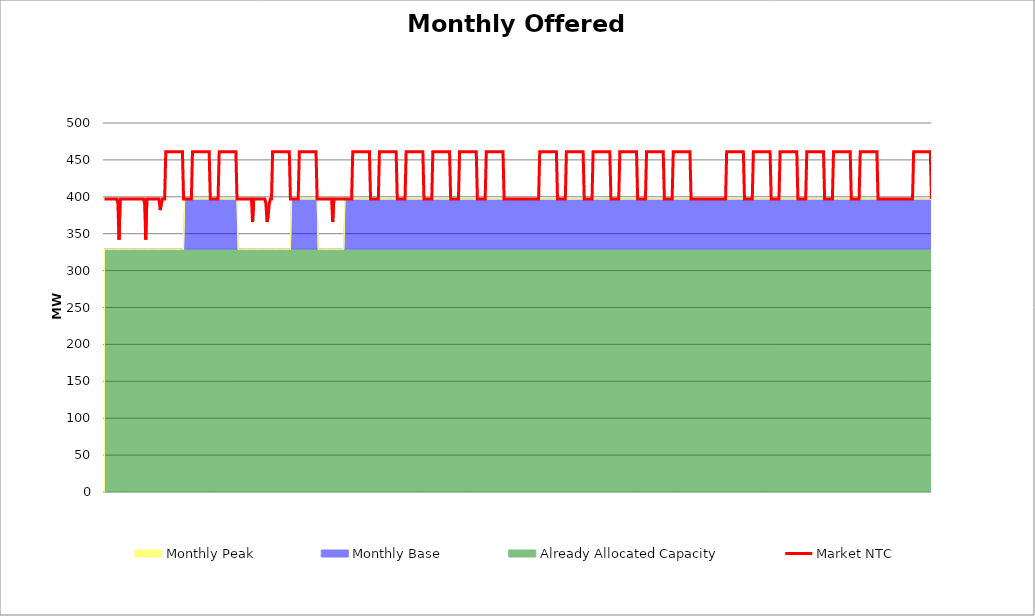
| Category | Market NTC |
|---|---|
| 0 | 397 |
| 1 | 397 |
| 2 | 397 |
| 3 | 397 |
| 4 | 397 |
| 5 | 397 |
| 6 | 397 |
| 7 | 397 |
| 8 | 397 |
| 9 | 397 |
| 10 | 397 |
| 11 | 397 |
| 12 | 391 |
| 13 | 342 |
| 14 | 397 |
| 15 | 397 |
| 16 | 397 |
| 17 | 397 |
| 18 | 397 |
| 19 | 397 |
| 20 | 397 |
| 21 | 397 |
| 22 | 397 |
| 23 | 397 |
| 24 | 397 |
| 25 | 397 |
| 26 | 397 |
| 27 | 397 |
| 28 | 397 |
| 29 | 397 |
| 30 | 397 |
| 31 | 397 |
| 32 | 397 |
| 33 | 397 |
| 34 | 397 |
| 35 | 397 |
| 36 | 391 |
| 37 | 342 |
| 38 | 397 |
| 39 | 397 |
| 40 | 397 |
| 41 | 397 |
| 42 | 397 |
| 43 | 397 |
| 44 | 397 |
| 45 | 397 |
| 46 | 397 |
| 47 | 397 |
| 48 | 397 |
| 49 | 397 |
| 50 | 382 |
| 51 | 391 |
| 52 | 397 |
| 53 | 397 |
| 54 | 397 |
| 55 | 461 |
| 56 | 461 |
| 57 | 461 |
| 58 | 461 |
| 59 | 461 |
| 60 | 461 |
| 61 | 461 |
| 62 | 461 |
| 63 | 461 |
| 64 | 461 |
| 65 | 461 |
| 66 | 461 |
| 67 | 461 |
| 68 | 461 |
| 69 | 461 |
| 70 | 461 |
| 71 | 397 |
| 72 | 397 |
| 73 | 397 |
| 74 | 397 |
| 75 | 397 |
| 76 | 397 |
| 77 | 397 |
| 78 | 397 |
| 79 | 461 |
| 80 | 461 |
| 81 | 461 |
| 82 | 461 |
| 83 | 461 |
| 84 | 461 |
| 85 | 461 |
| 86 | 461 |
| 87 | 461 |
| 88 | 461 |
| 89 | 461 |
| 90 | 461 |
| 91 | 461 |
| 92 | 461 |
| 93 | 461 |
| 94 | 461 |
| 95 | 397 |
| 96 | 397 |
| 97 | 397 |
| 98 | 397 |
| 99 | 397 |
| 100 | 397 |
| 101 | 397 |
| 102 | 397 |
| 103 | 461 |
| 104 | 461 |
| 105 | 461 |
| 106 | 461 |
| 107 | 461 |
| 108 | 461 |
| 109 | 461 |
| 110 | 461 |
| 111 | 461 |
| 112 | 461 |
| 113 | 461 |
| 114 | 461 |
| 115 | 461 |
| 116 | 461 |
| 117 | 461 |
| 118 | 461 |
| 119 | 397 |
| 120 | 397 |
| 121 | 397 |
| 122 | 397 |
| 123 | 397 |
| 124 | 397 |
| 125 | 397 |
| 126 | 397 |
| 127 | 397 |
| 128 | 397 |
| 129 | 397 |
| 130 | 397 |
| 131 | 397 |
| 132 | 397 |
| 133 | 366 |
| 134 | 397 |
| 135 | 397 |
| 136 | 397 |
| 137 | 397 |
| 138 | 397 |
| 139 | 397 |
| 140 | 397 |
| 141 | 397 |
| 142 | 397 |
| 143 | 397 |
| 144 | 397 |
| 145 | 391 |
| 146 | 366 |
| 147 | 374 |
| 148 | 391 |
| 149 | 397 |
| 150 | 397 |
| 151 | 461 |
| 152 | 461 |
| 153 | 461 |
| 154 | 461 |
| 155 | 461 |
| 156 | 461 |
| 157 | 461 |
| 158 | 461 |
| 159 | 461 |
| 160 | 461 |
| 161 | 461 |
| 162 | 461 |
| 163 | 461 |
| 164 | 461 |
| 165 | 461 |
| 166 | 461 |
| 167 | 397 |
| 168 | 397 |
| 169 | 397 |
| 170 | 397 |
| 171 | 397 |
| 172 | 397 |
| 173 | 397 |
| 174 | 397 |
| 175 | 461 |
| 176 | 461 |
| 177 | 461 |
| 178 | 461 |
| 179 | 461 |
| 180 | 461 |
| 181 | 461 |
| 182 | 461 |
| 183 | 461 |
| 184 | 461 |
| 185 | 461 |
| 186 | 461 |
| 187 | 461 |
| 188 | 461 |
| 189 | 461 |
| 190 | 461 |
| 191 | 397 |
| 192 | 397 |
| 193 | 397 |
| 194 | 397 |
| 195 | 397 |
| 196 | 397 |
| 197 | 397 |
| 198 | 397 |
| 199 | 397 |
| 200 | 397 |
| 201 | 397 |
| 202 | 397 |
| 203 | 397 |
| 204 | 397 |
| 205 | 366 |
| 206 | 397 |
| 207 | 397 |
| 208 | 397 |
| 209 | 397 |
| 210 | 397 |
| 211 | 397 |
| 212 | 397 |
| 213 | 397 |
| 214 | 397 |
| 215 | 397 |
| 216 | 397 |
| 217 | 397 |
| 218 | 397 |
| 219 | 397 |
| 220 | 397 |
| 221 | 397 |
| 222 | 397 |
| 223 | 461 |
| 224 | 461 |
| 225 | 461 |
| 226 | 461 |
| 227 | 461 |
| 228 | 461 |
| 229 | 461 |
| 230 | 461 |
| 231 | 461 |
| 232 | 461 |
| 233 | 461 |
| 234 | 461 |
| 235 | 461 |
| 236 | 461 |
| 237 | 461 |
| 238 | 461 |
| 239 | 397 |
| 240 | 397 |
| 241 | 397 |
| 242 | 397 |
| 243 | 397 |
| 244 | 397 |
| 245 | 397 |
| 246 | 397 |
| 247 | 461 |
| 248 | 461 |
| 249 | 461 |
| 250 | 461 |
| 251 | 461 |
| 252 | 461 |
| 253 | 461 |
| 254 | 461 |
| 255 | 461 |
| 256 | 461 |
| 257 | 461 |
| 258 | 461 |
| 259 | 461 |
| 260 | 461 |
| 261 | 461 |
| 262 | 461 |
| 263 | 397 |
| 264 | 397 |
| 265 | 397 |
| 266 | 397 |
| 267 | 397 |
| 268 | 397 |
| 269 | 397 |
| 270 | 397 |
| 271 | 461 |
| 272 | 461 |
| 273 | 461 |
| 274 | 461 |
| 275 | 461 |
| 276 | 461 |
| 277 | 461 |
| 278 | 461 |
| 279 | 461 |
| 280 | 461 |
| 281 | 461 |
| 282 | 461 |
| 283 | 461 |
| 284 | 461 |
| 285 | 461 |
| 286 | 461 |
| 287 | 397 |
| 288 | 397 |
| 289 | 397 |
| 290 | 397 |
| 291 | 397 |
| 292 | 397 |
| 293 | 397 |
| 294 | 397 |
| 295 | 461 |
| 296 | 461 |
| 297 | 461 |
| 298 | 461 |
| 299 | 461 |
| 300 | 461 |
| 301 | 461 |
| 302 | 461 |
| 303 | 461 |
| 304 | 461 |
| 305 | 461 |
| 306 | 461 |
| 307 | 461 |
| 308 | 461 |
| 309 | 461 |
| 310 | 461 |
| 311 | 397 |
| 312 | 397 |
| 313 | 397 |
| 314 | 397 |
| 315 | 397 |
| 316 | 397 |
| 317 | 397 |
| 318 | 397 |
| 319 | 461 |
| 320 | 461 |
| 321 | 461 |
| 322 | 461 |
| 323 | 461 |
| 324 | 461 |
| 325 | 461 |
| 326 | 461 |
| 327 | 461 |
| 328 | 461 |
| 329 | 461 |
| 330 | 461 |
| 331 | 461 |
| 332 | 461 |
| 333 | 461 |
| 334 | 461 |
| 335 | 397 |
| 336 | 397 |
| 337 | 397 |
| 338 | 397 |
| 339 | 397 |
| 340 | 397 |
| 341 | 397 |
| 342 | 397 |
| 343 | 461 |
| 344 | 461 |
| 345 | 461 |
| 346 | 461 |
| 347 | 461 |
| 348 | 461 |
| 349 | 461 |
| 350 | 461 |
| 351 | 461 |
| 352 | 461 |
| 353 | 461 |
| 354 | 461 |
| 355 | 461 |
| 356 | 461 |
| 357 | 461 |
| 358 | 461 |
| 359 | 397 |
| 360 | 397 |
| 361 | 397 |
| 362 | 397 |
| 363 | 397 |
| 364 | 397 |
| 365 | 397 |
| 366 | 397 |
| 367 | 397 |
| 368 | 397 |
| 369 | 397 |
| 370 | 397 |
| 371 | 397 |
| 372 | 397 |
| 373 | 397 |
| 374 | 397 |
| 375 | 397 |
| 376 | 397 |
| 377 | 397 |
| 378 | 397 |
| 379 | 397 |
| 380 | 397 |
| 381 | 397 |
| 382 | 397 |
| 383 | 397 |
| 384 | 397 |
| 385 | 397 |
| 386 | 397 |
| 387 | 397 |
| 388 | 397 |
| 389 | 397 |
| 390 | 397 |
| 391 | 461 |
| 392 | 461 |
| 393 | 461 |
| 394 | 461 |
| 395 | 461 |
| 396 | 461 |
| 397 | 461 |
| 398 | 461 |
| 399 | 461 |
| 400 | 461 |
| 401 | 461 |
| 402 | 461 |
| 403 | 461 |
| 404 | 461 |
| 405 | 461 |
| 406 | 461 |
| 407 | 397 |
| 408 | 397 |
| 409 | 397 |
| 410 | 397 |
| 411 | 397 |
| 412 | 397 |
| 413 | 397 |
| 414 | 397 |
| 415 | 461 |
| 416 | 461 |
| 417 | 461 |
| 418 | 461 |
| 419 | 461 |
| 420 | 461 |
| 421 | 461 |
| 422 | 461 |
| 423 | 461 |
| 424 | 461 |
| 425 | 461 |
| 426 | 461 |
| 427 | 461 |
| 428 | 461 |
| 429 | 461 |
| 430 | 461 |
| 431 | 397 |
| 432 | 397 |
| 433 | 397 |
| 434 | 397 |
| 435 | 397 |
| 436 | 397 |
| 437 | 397 |
| 438 | 397 |
| 439 | 461 |
| 440 | 461 |
| 441 | 461 |
| 442 | 461 |
| 443 | 461 |
| 444 | 461 |
| 445 | 461 |
| 446 | 461 |
| 447 | 461 |
| 448 | 461 |
| 449 | 461 |
| 450 | 461 |
| 451 | 461 |
| 452 | 461 |
| 453 | 461 |
| 454 | 461 |
| 455 | 397 |
| 456 | 397 |
| 457 | 397 |
| 458 | 397 |
| 459 | 397 |
| 460 | 397 |
| 461 | 397 |
| 462 | 397 |
| 463 | 461 |
| 464 | 461 |
| 465 | 461 |
| 466 | 461 |
| 467 | 461 |
| 468 | 461 |
| 469 | 461 |
| 470 | 461 |
| 471 | 461 |
| 472 | 461 |
| 473 | 461 |
| 474 | 461 |
| 475 | 461 |
| 476 | 461 |
| 477 | 461 |
| 478 | 461 |
| 479 | 397 |
| 480 | 397 |
| 481 | 397 |
| 482 | 397 |
| 483 | 397 |
| 484 | 397 |
| 485 | 397 |
| 486 | 397 |
| 487 | 461 |
| 488 | 461 |
| 489 | 461 |
| 490 | 461 |
| 491 | 461 |
| 492 | 461 |
| 493 | 461 |
| 494 | 461 |
| 495 | 461 |
| 496 | 461 |
| 497 | 461 |
| 498 | 461 |
| 499 | 461 |
| 500 | 461 |
| 501 | 461 |
| 502 | 461 |
| 503 | 397 |
| 504 | 397 |
| 505 | 397 |
| 506 | 397 |
| 507 | 397 |
| 508 | 397 |
| 509 | 397 |
| 510 | 397 |
| 511 | 461 |
| 512 | 461 |
| 513 | 461 |
| 514 | 461 |
| 515 | 461 |
| 516 | 461 |
| 517 | 461 |
| 518 | 461 |
| 519 | 461 |
| 520 | 461 |
| 521 | 461 |
| 522 | 461 |
| 523 | 461 |
| 524 | 461 |
| 525 | 461 |
| 526 | 461 |
| 527 | 397 |
| 528 | 397 |
| 529 | 397 |
| 530 | 397 |
| 531 | 397 |
| 532 | 397 |
| 533 | 397 |
| 534 | 397 |
| 535 | 397 |
| 536 | 397 |
| 537 | 397 |
| 538 | 397 |
| 539 | 397 |
| 540 | 397 |
| 541 | 397 |
| 542 | 397 |
| 543 | 397 |
| 544 | 397 |
| 545 | 397 |
| 546 | 397 |
| 547 | 397 |
| 548 | 397 |
| 549 | 397 |
| 550 | 397 |
| 551 | 397 |
| 552 | 397 |
| 553 | 397 |
| 554 | 397 |
| 555 | 397 |
| 556 | 397 |
| 557 | 397 |
| 558 | 397 |
| 559 | 461 |
| 560 | 461 |
| 561 | 461 |
| 562 | 461 |
| 563 | 461 |
| 564 | 461 |
| 565 | 461 |
| 566 | 461 |
| 567 | 461 |
| 568 | 461 |
| 569 | 461 |
| 570 | 461 |
| 571 | 461 |
| 572 | 461 |
| 573 | 461 |
| 574 | 461 |
| 575 | 397 |
| 576 | 397 |
| 577 | 397 |
| 578 | 397 |
| 579 | 397 |
| 580 | 397 |
| 581 | 397 |
| 582 | 397 |
| 583 | 461 |
| 584 | 461 |
| 585 | 461 |
| 586 | 461 |
| 587 | 461 |
| 588 | 461 |
| 589 | 461 |
| 590 | 461 |
| 591 | 461 |
| 592 | 461 |
| 593 | 461 |
| 594 | 461 |
| 595 | 461 |
| 596 | 461 |
| 597 | 461 |
| 598 | 461 |
| 599 | 397 |
| 600 | 397 |
| 601 | 397 |
| 602 | 397 |
| 603 | 397 |
| 604 | 397 |
| 605 | 397 |
| 606 | 397 |
| 607 | 461 |
| 608 | 461 |
| 609 | 461 |
| 610 | 461 |
| 611 | 461 |
| 612 | 461 |
| 613 | 461 |
| 614 | 461 |
| 615 | 461 |
| 616 | 461 |
| 617 | 461 |
| 618 | 461 |
| 619 | 461 |
| 620 | 461 |
| 621 | 461 |
| 622 | 461 |
| 623 | 397 |
| 624 | 397 |
| 625 | 397 |
| 626 | 397 |
| 627 | 397 |
| 628 | 397 |
| 629 | 397 |
| 630 | 397 |
| 631 | 461 |
| 632 | 461 |
| 633 | 461 |
| 634 | 461 |
| 635 | 461 |
| 636 | 461 |
| 637 | 461 |
| 638 | 461 |
| 639 | 461 |
| 640 | 461 |
| 641 | 461 |
| 642 | 461 |
| 643 | 461 |
| 644 | 461 |
| 645 | 461 |
| 646 | 461 |
| 647 | 397 |
| 648 | 397 |
| 649 | 397 |
| 650 | 397 |
| 651 | 397 |
| 652 | 397 |
| 653 | 397 |
| 654 | 397 |
| 655 | 461 |
| 656 | 461 |
| 657 | 461 |
| 658 | 461 |
| 659 | 461 |
| 660 | 461 |
| 661 | 461 |
| 662 | 461 |
| 663 | 461 |
| 664 | 461 |
| 665 | 461 |
| 666 | 461 |
| 667 | 461 |
| 668 | 461 |
| 669 | 461 |
| 670 | 461 |
| 671 | 397 |
| 672 | 397 |
| 673 | 397 |
| 674 | 397 |
| 675 | 397 |
| 676 | 397 |
| 677 | 397 |
| 678 | 397 |
| 679 | 461 |
| 680 | 461 |
| 681 | 461 |
| 682 | 461 |
| 683 | 461 |
| 684 | 461 |
| 685 | 461 |
| 686 | 461 |
| 687 | 461 |
| 688 | 461 |
| 689 | 461 |
| 690 | 461 |
| 691 | 461 |
| 692 | 461 |
| 693 | 461 |
| 694 | 461 |
| 695 | 397 |
| 696 | 397 |
| 697 | 397 |
| 698 | 397 |
| 699 | 397 |
| 700 | 397 |
| 701 | 397 |
| 702 | 397 |
| 703 | 397 |
| 704 | 397 |
| 705 | 397 |
| 706 | 397 |
| 707 | 397 |
| 708 | 397 |
| 709 | 397 |
| 710 | 397 |
| 711 | 397 |
| 712 | 397 |
| 713 | 397 |
| 714 | 397 |
| 715 | 397 |
| 716 | 397 |
| 717 | 397 |
| 718 | 397 |
| 719 | 397 |
| 720 | 397 |
| 721 | 397 |
| 722 | 397 |
| 723 | 397 |
| 724 | 397 |
| 725 | 397 |
| 726 | 397 |
| 727 | 461 |
| 728 | 461 |
| 729 | 461 |
| 730 | 461 |
| 731 | 461 |
| 732 | 461 |
| 733 | 461 |
| 734 | 461 |
| 735 | 461 |
| 736 | 461 |
| 737 | 461 |
| 738 | 461 |
| 739 | 461 |
| 740 | 461 |
| 741 | 461 |
| 742 | 461 |
| 743 | 397 |